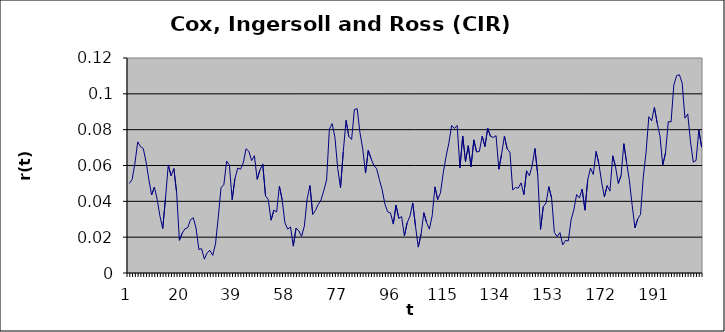
| Category | Series 0 |
|---|---|
| 0 | 0.05 |
| 1 | 0.052 |
| 2 | 0.061 |
| 3 | 0.073 |
| 4 | 0.071 |
| 5 | 0.069 |
| 6 | 0.062 |
| 7 | 0.052 |
| 8 | 0.044 |
| 9 | 0.048 |
| 10 | 0.041 |
| 11 | 0.032 |
| 12 | 0.025 |
| 13 | 0.042 |
| 14 | 0.06 |
| 15 | 0.054 |
| 16 | 0.058 |
| 17 | 0.045 |
| 18 | 0.018 |
| 19 | 0.022 |
| 20 | 0.025 |
| 21 | 0.025 |
| 22 | 0.03 |
| 23 | 0.031 |
| 24 | 0.025 |
| 25 | 0.013 |
| 26 | 0.014 |
| 27 | 0.008 |
| 28 | 0.011 |
| 29 | 0.013 |
| 30 | 0.01 |
| 31 | 0.016 |
| 32 | 0.031 |
| 33 | 0.048 |
| 34 | 0.049 |
| 35 | 0.062 |
| 36 | 0.06 |
| 37 | 0.041 |
| 38 | 0.053 |
| 39 | 0.059 |
| 40 | 0.058 |
| 41 | 0.061 |
| 42 | 0.069 |
| 43 | 0.068 |
| 44 | 0.063 |
| 45 | 0.065 |
| 46 | 0.052 |
| 47 | 0.058 |
| 48 | 0.061 |
| 49 | 0.043 |
| 50 | 0.041 |
| 51 | 0.029 |
| 52 | 0.035 |
| 53 | 0.034 |
| 54 | 0.048 |
| 55 | 0.041 |
| 56 | 0.028 |
| 57 | 0.024 |
| 58 | 0.026 |
| 59 | 0.015 |
| 60 | 0.025 |
| 61 | 0.023 |
| 62 | 0.02 |
| 63 | 0.026 |
| 64 | 0.041 |
| 65 | 0.049 |
| 66 | 0.033 |
| 67 | 0.035 |
| 68 | 0.038 |
| 69 | 0.041 |
| 70 | 0.046 |
| 71 | 0.052 |
| 72 | 0.08 |
| 73 | 0.083 |
| 74 | 0.076 |
| 75 | 0.058 |
| 76 | 0.048 |
| 77 | 0.068 |
| 78 | 0.085 |
| 79 | 0.076 |
| 80 | 0.075 |
| 81 | 0.091 |
| 82 | 0.092 |
| 83 | 0.078 |
| 84 | 0.069 |
| 85 | 0.056 |
| 86 | 0.068 |
| 87 | 0.064 |
| 88 | 0.06 |
| 89 | 0.058 |
| 90 | 0.052 |
| 91 | 0.046 |
| 92 | 0.038 |
| 93 | 0.034 |
| 94 | 0.033 |
| 95 | 0.027 |
| 96 | 0.038 |
| 97 | 0.03 |
| 98 | 0.031 |
| 99 | 0.021 |
| 100 | 0.028 |
| 101 | 0.032 |
| 102 | 0.039 |
| 103 | 0.026 |
| 104 | 0.014 |
| 105 | 0.022 |
| 106 | 0.034 |
| 107 | 0.028 |
| 108 | 0.024 |
| 109 | 0.032 |
| 110 | 0.048 |
| 111 | 0.041 |
| 112 | 0.045 |
| 113 | 0.056 |
| 114 | 0.065 |
| 115 | 0.072 |
| 116 | 0.082 |
| 117 | 0.081 |
| 118 | 0.082 |
| 119 | 0.059 |
| 120 | 0.076 |
| 121 | 0.062 |
| 122 | 0.071 |
| 123 | 0.059 |
| 124 | 0.074 |
| 125 | 0.068 |
| 126 | 0.068 |
| 127 | 0.076 |
| 128 | 0.071 |
| 129 | 0.081 |
| 130 | 0.076 |
| 131 | 0.076 |
| 132 | 0.077 |
| 133 | 0.058 |
| 134 | 0.066 |
| 135 | 0.076 |
| 136 | 0.069 |
| 137 | 0.067 |
| 138 | 0.046 |
| 139 | 0.048 |
| 140 | 0.047 |
| 141 | 0.05 |
| 142 | 0.044 |
| 143 | 0.057 |
| 144 | 0.054 |
| 145 | 0.06 |
| 146 | 0.069 |
| 147 | 0.055 |
| 148 | 0.024 |
| 149 | 0.037 |
| 150 | 0.039 |
| 151 | 0.048 |
| 152 | 0.042 |
| 153 | 0.023 |
| 154 | 0.02 |
| 155 | 0.023 |
| 156 | 0.016 |
| 157 | 0.018 |
| 158 | 0.018 |
| 159 | 0.03 |
| 160 | 0.035 |
| 161 | 0.044 |
| 162 | 0.042 |
| 163 | 0.047 |
| 164 | 0.035 |
| 165 | 0.052 |
| 166 | 0.059 |
| 167 | 0.055 |
| 168 | 0.068 |
| 169 | 0.061 |
| 170 | 0.051 |
| 171 | 0.042 |
| 172 | 0.049 |
| 173 | 0.046 |
| 174 | 0.065 |
| 175 | 0.059 |
| 176 | 0.05 |
| 177 | 0.054 |
| 178 | 0.072 |
| 179 | 0.062 |
| 180 | 0.052 |
| 181 | 0.038 |
| 182 | 0.025 |
| 183 | 0.03 |
| 184 | 0.033 |
| 185 | 0.053 |
| 186 | 0.067 |
| 187 | 0.087 |
| 188 | 0.085 |
| 189 | 0.092 |
| 190 | 0.084 |
| 191 | 0.077 |
| 192 | 0.06 |
| 193 | 0.067 |
| 194 | 0.084 |
| 195 | 0.084 |
| 196 | 0.105 |
| 197 | 0.11 |
| 198 | 0.111 |
| 199 | 0.106 |
| 200 | 0.086 |
| 201 | 0.089 |
| 202 | 0.073 |
| 203 | 0.062 |
| 204 | 0.063 |
| 205 | 0.08 |
| 206 | 0.07 |